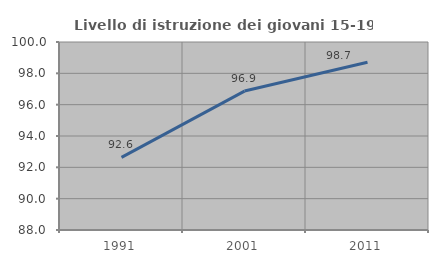
| Category | Livello di istruzione dei giovani 15-19 anni |
|---|---|
| 1991.0 | 92.634 |
| 2001.0 | 96.868 |
| 2011.0 | 98.711 |